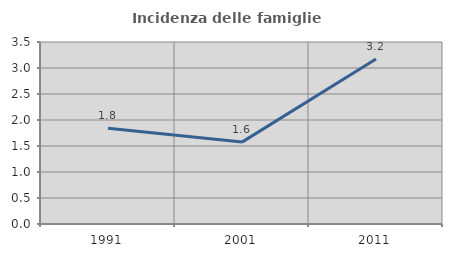
| Category | Incidenza delle famiglie numerose |
|---|---|
| 1991.0 | 1.84 |
| 2001.0 | 1.575 |
| 2011.0 | 3.175 |